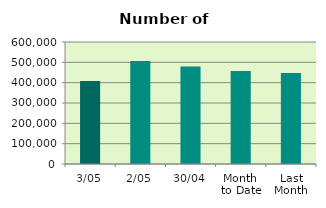
| Category | Series 0 |
|---|---|
| 3/05 | 407924 |
| 2/05 | 506528 |
| 30/04 | 479450 |
| Month 
to Date | 457226 |
| Last
Month | 447135.9 |